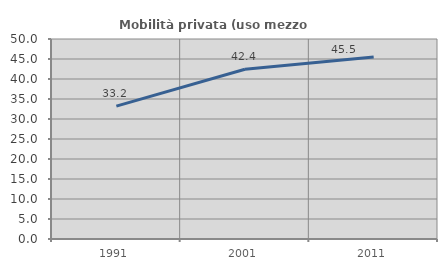
| Category | Mobilità privata (uso mezzo privato) |
|---|---|
| 1991.0 | 33.228 |
| 2001.0 | 42.446 |
| 2011.0 | 45.521 |